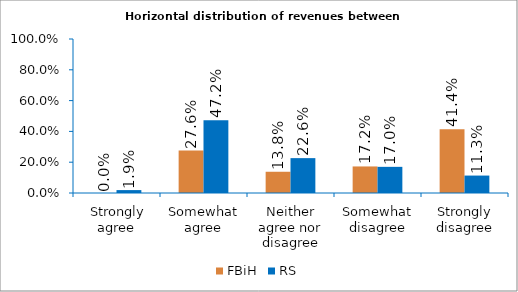
| Category | FBiH | RS |
|---|---|---|
|  Strongly agree | 0 | 0.019 |
| Somewhat agree | 0.276 | 0.472 |
| Neither agree nor disagree | 0.138 | 0.226 |
| Somewhat disagree | 0.172 | 0.17 |
| Strongly disagree | 0.414 | 0.113 |